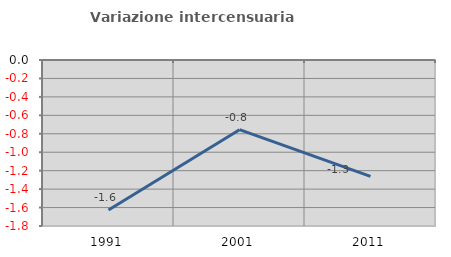
| Category | Variazione intercensuaria annua |
|---|---|
| 1991.0 | -1.627 |
| 2001.0 | -0.755 |
| 2011.0 | -1.263 |